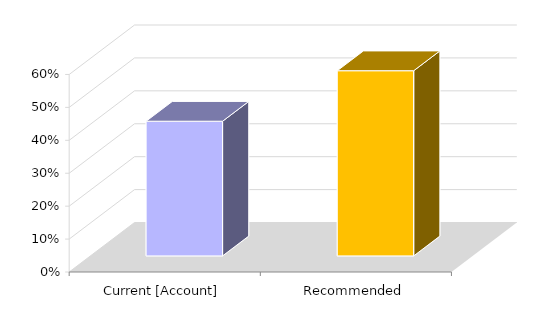
| Category | Series 0 |
|---|---|
| Current [Account] | 0.409 |
| Recommended | 0.562 |